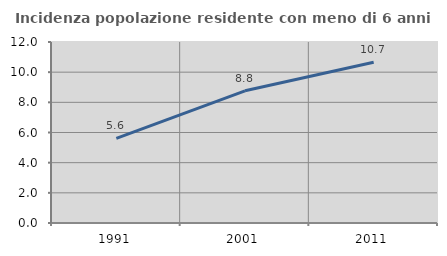
| Category | Incidenza popolazione residente con meno di 6 anni |
|---|---|
| 1991.0 | 5.607 |
| 2001.0 | 8.763 |
| 2011.0 | 10.662 |